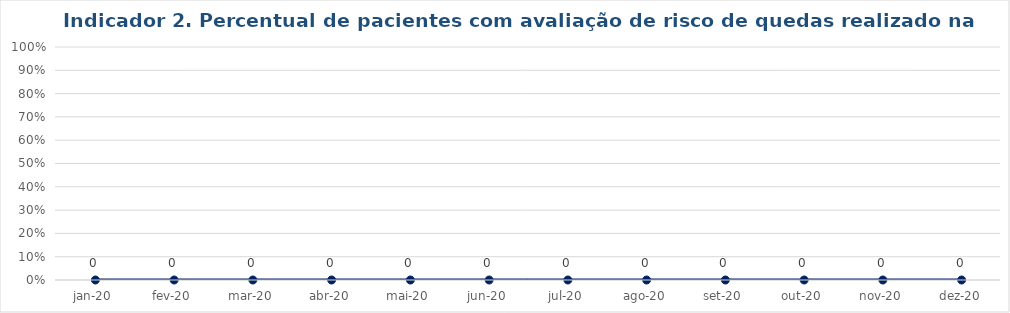
| Category | Total |
|---|---|
| jan-20 | 0 |
| fev-20 | 0 |
| mar-20 | 0 |
| abr-20 | 0 |
| mai-20 | 0 |
| jun-20 | 0 |
| jul-20 | 0 |
| ago-20 | 0 |
| set-20 | 0 |
| out-20 | 0 |
| nov-20 | 0 |
| dez-20 | 0 |